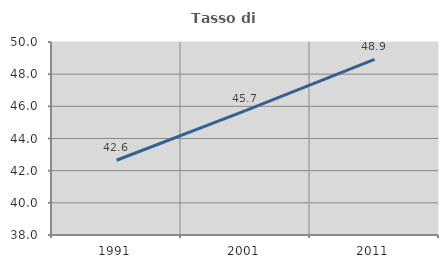
| Category | Tasso di occupazione   |
|---|---|
| 1991.0 | 42.647 |
| 2001.0 | 45.728 |
| 2011.0 | 48.921 |